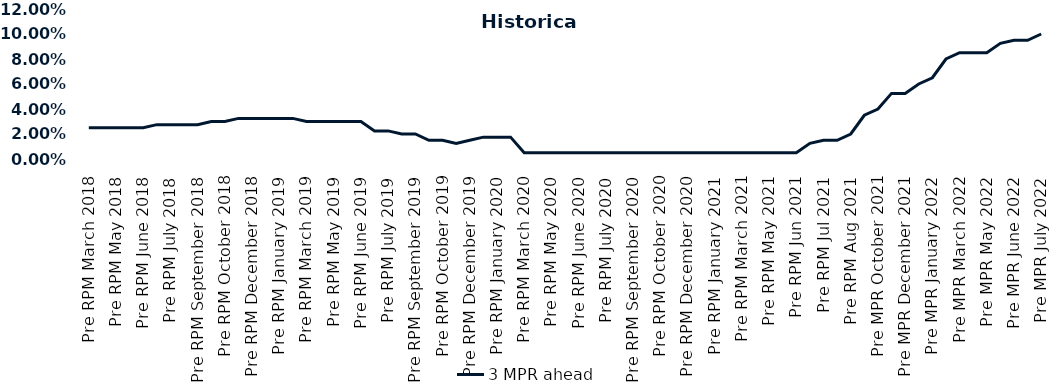
| Category | 3 MPR ahead |
|---|---|
| Pre RPM March 2018 | 0.025 |
| Post RPM March 2018 | 0.025 |
| Pre RPM May 2018 | 0.025 |
| Post RPM May 2018 | 0.025 |
| Pre RPM June 2018 | 0.025 |
| Post RPM June 2018 | 0.028 |
| Pre RPM July 2018 | 0.028 |
| Post RPM July 2018 | 0.028 |
| Pre RPM September 2018 | 0.028 |
| Post RPM September 2018 | 0.03 |
| Pre RPM October 2018 | 0.03 |
| Post RPM October 2018 | 0.032 |
| Pre RPM December 2018 | 0.032 |
| Post RPM December 2018 | 0.032 |
| Pre RPM January 2019 | 0.032 |
| Post RPM January 2019 | 0.032 |
| Pre RPM March 2019 | 0.03 |
| Post RPM March 2019 | 0.03 |
| Pre RPM May 2019 | 0.03 |
| Post RPM May 2019 | 0.03 |
| Pre RPM June 2019 | 0.03 |
| Post RPM June 2019 | 0.022 |
| Pre RPM July 2019 | 0.022 |
| Post RPM July 2019 | 0.02 |
| Pre RPM September 2019 | 0.02 |
| Post RPM September 2019 | 0.015 |
| Pre RPM October 2019 | 0.015 |
| Post RPM October 2019 | 0.012 |
| Pre RPM December 2019 | 0.015 |
| Post RPM December 2019 | 0.018 |
| Pre RPM January 2020 | 0.018 |
| Post RPM January 2020 | 0.018 |
| Pre RPM March 2020 | 0.005 |
| Post RPM March 2020 | 0.005 |
| Pre RPM May 2020 | 0.005 |
| Post RPM May 2020 | 0.005 |
| Pre RPM June 2020 | 0.005 |
| Post RPM June 2020 | 0.005 |
| Pre RPM July 2020 | 0.005 |
| Post RPM July 2020 | 0.005 |
| Pre RPM September 2020 | 0.005 |
| Post RPM September 2020 | 0.005 |
| Pre RPM October 2020 | 0.005 |
| Post RPM October 2020 | 0.005 |
| Pre RPM December 2020 | 0.005 |
|  Post RPM December 2020 | 0.005 |
| Pre RPM January 2021 | 0.005 |
| Post RPM January 2021 | 0.005 |
|  Pre RPM March 2021 | 0.005 |
|  Post RPM March 2021 | 0.005 |
|  Pre RPM May 2021 | 0.005 |
|  Post RPM May 2021 | 0.005 |
|  Pre RPM Jun 2021 | 0.005 |
|   Post RPM Jun 2021 | 0.012 |
| Pre RPM Jul 2021 | 0.015 |
|  Post RPM Jul 2021 | 0.015 |
| Pre RPM Aug 2021 | 0.02 |
|  Post RPM Aug 2021 | 0.035 |
| Pre MPR October 2021 | 0.04 |
| Post MPR October 2021 | 0.052 |
| Pre MPR December 2021 | 0.052 |
| Post MPR December 2021 | 0.06 |
| Pre MPR January 2022 | 0.065 |
| Post MPR January 2022 | 0.08 |
| Pre MPR March 2022 | 0.085 |
| Post MPR March 2022 | 0.085 |
| Pre MPR May 2022 | 0.085 |
| Post MPR May 2022 | 0.092 |
| Pre MPR June 2022 | 0.095 |
| Post MPR June 2022 | 0.095 |
| Pre MPR July 2022 | 0.1 |